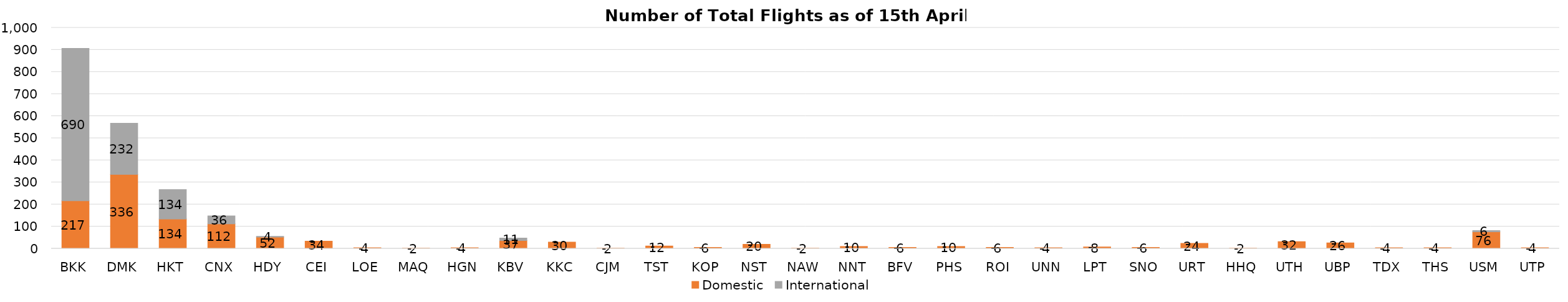
| Category | Domestic | International |
|---|---|---|
| BKK | 217 | 690 |
| DMK | 336 | 232 |
| HKT | 134 | 134 |
| CNX | 112 | 36 |
| HDY | 52 | 4 |
| CEI | 34 | 0 |
| LOE | 4 | 0 |
| MAQ | 2 | 0 |
| HGN | 4 | 0 |
| KBV | 37 | 11 |
| KKC | 30 | 0 |
| CJM | 2 | 0 |
| TST | 12 | 0 |
| KOP | 6 | 0 |
| NST | 20 | 0 |
| NAW | 2 | 0 |
| NNT | 10 | 0 |
| BFV | 6 | 0 |
| PHS | 10 | 0 |
| ROI | 6 | 0 |
| UNN | 4 | 0 |
| LPT | 8 | 0 |
| SNO | 6 | 0 |
| URT | 24 | 0 |
| HHQ | 2 | 0 |
| UTH | 32 | 0 |
| UBP | 26 | 0 |
| TDX | 4 | 0 |
| THS | 4 | 0 |
| USM | 76 | 6 |
| UTP | 4 | 0 |